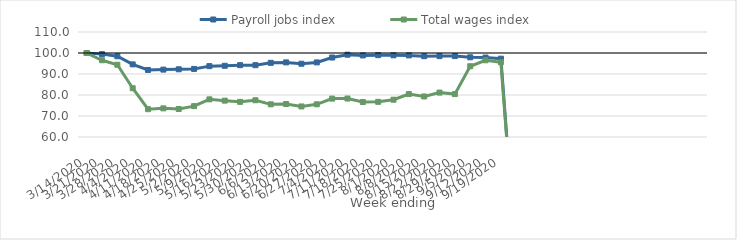
| Category | Payroll jobs index | Total wages index |
|---|---|---|
| 14/03/2020 | 100 | 100 |
| 21/03/2020 | 99.463 | 96.556 |
| 28/03/2020 | 98.465 | 94.404 |
| 04/04/2020 | 94.576 | 83.221 |
| 11/04/2020 | 91.924 | 73.248 |
| 18/04/2020 | 92.087 | 73.644 |
| 25/04/2020 | 92.245 | 73.344 |
| 02/05/2020 | 92.422 | 74.699 |
| 09/05/2020 | 93.748 | 77.926 |
| 16/05/2020 | 93.912 | 77.316 |
| 23/05/2020 | 94.206 | 76.741 |
| 30/05/2020 | 94.198 | 77.506 |
| 06/06/2020 | 95.313 | 75.556 |
| 13/06/2020 | 95.529 | 75.709 |
| 20/06/2020 | 94.895 | 74.553 |
| 27/06/2020 | 95.518 | 75.571 |
| 04/07/2020 | 97.836 | 78.278 |
| 11/07/2020 | 99.197 | 78.316 |
| 18/07/2020 | 98.836 | 76.666 |
| 25/07/2020 | 98.97 | 76.752 |
| 01/08/2020 | 98.906 | 77.758 |
| 08/08/2020 | 98.862 | 80.452 |
| 15/08/2020 | 98.468 | 79.307 |
| 22/08/2020 | 98.519 | 81.157 |
| 29/08/2020 | 98.539 | 80.429 |
| 05/09/2020 | 97.956 | 93.699 |
| 12/09/2020 | 97.834 | 96.534 |
| 19/09/2020 | 97.301 | 95.588 |